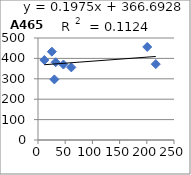
| Category | A465 |
|---|---|
| 25.5 | 433 |
| 61.3 | 356 |
| 11.7 | 392 |
| 216.5 | 372 |
| 46.8 | 370 |
| 32.5 | 381 |
| 200.8 | 456 |
| 30.1 | 297 |